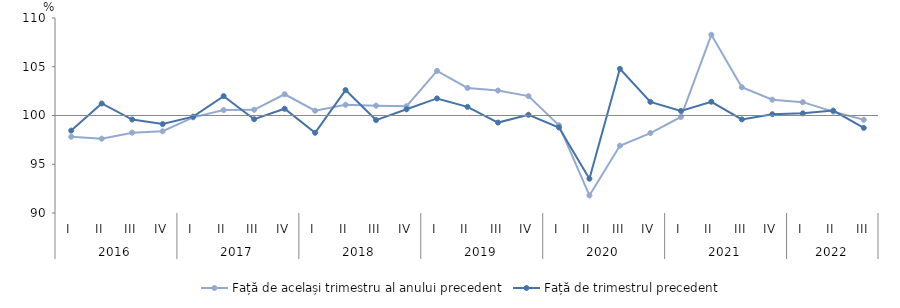
| Category | Față de același trimestru al anului precedent | Față de trimestrul precedent |
|---|---|---|
| 0 | 97.825 | 98.452 |
| 1 | 97.621 | 101.233 |
| 2 | 98.239 | 99.588 |
| 3 | 98.385 | 99.123 |
| 4 | 99.811 | 99.879 |
| 5 | 100.556 | 101.989 |
| 6 | 100.586 | 99.618 |
| 7 | 102.179 | 100.693 |
| 8 | 100.491 | 98.228 |
| 9 | 101.097 | 102.604 |
| 10 | 101.008 | 99.53 |
| 11 | 100.954 | 100.639 |
| 12 | 104.574 | 101.751 |
| 13 | 102.823 | 100.886 |
| 14 | 102.56 | 99.275 |
| 15 | 101.986 | 100.076 |
| 16 | 99 | 98.772 |
| 17 | 91.8 | 93.516 |
| 18 | 96.9 | 104.788 |
| 19 | 98.2 | 101.4 |
| 20 | 99.847 | 100.472 |
| 21 | 108.274 | 101.409 |
| 22 | 102.9 | 99.6 |
| 23 | 101.623 | 100.13 |
| 24 | 101.369 | 100.22 |
| 25 | 100.4 | 100.5 |
| 26 | 99.559 | 98.729 |